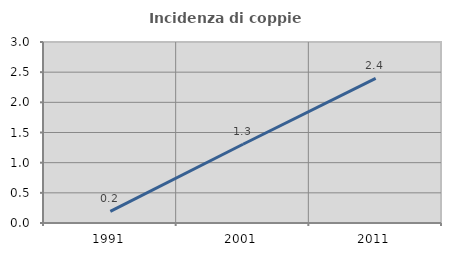
| Category | Incidenza di coppie miste |
|---|---|
| 1991.0 | 0.193 |
| 2001.0 | 1.305 |
| 2011.0 | 2.399 |